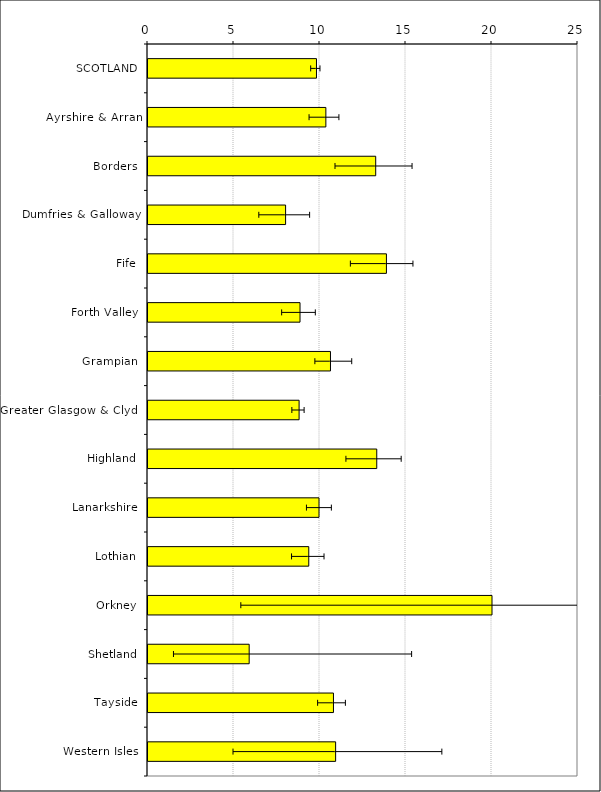
| Category | Estimate |
|---|---|
| SCOTLAND | 9.795 |
| Ayrshire & Arran | 10.341 |
| Borders | 13.239 |
| Dumfries & Galloway | 8 |
| Fife | 13.862 |
| Forth Valley | 8.839 |
| Grampian | 10.609 |
| Greater Glasgow & Clyde | 8.785 |
| Highland | 13.3 |
| Lanarkshire | 9.942 |
| Lothian | 9.347 |
| Orkney | 20 |
| Shetland | 5.882 |
| Tayside | 10.783 |
| Western Isles | 10.909 |